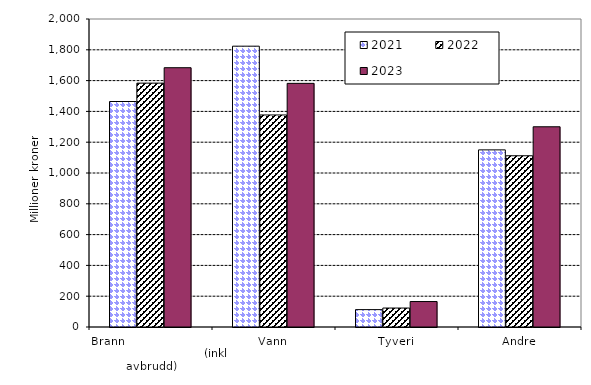
| Category | 2021 | 2022 | 2023 |
|---|---|---|---|
| Brann                                                       (inkl avbrudd) | 1464.198 | 1583.578 | 1683.65 |
| Vann | 1823.524 | 1376.879 | 1582.094 |
| Tyveri | 112.873 | 123.137 | 165.339 |
| Andre | 1150.229 | 1112 | 1300.133 |